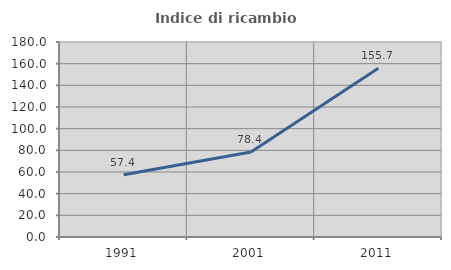
| Category | Indice di ricambio occupazionale  |
|---|---|
| 1991.0 | 57.384 |
| 2001.0 | 78.387 |
| 2011.0 | 155.731 |